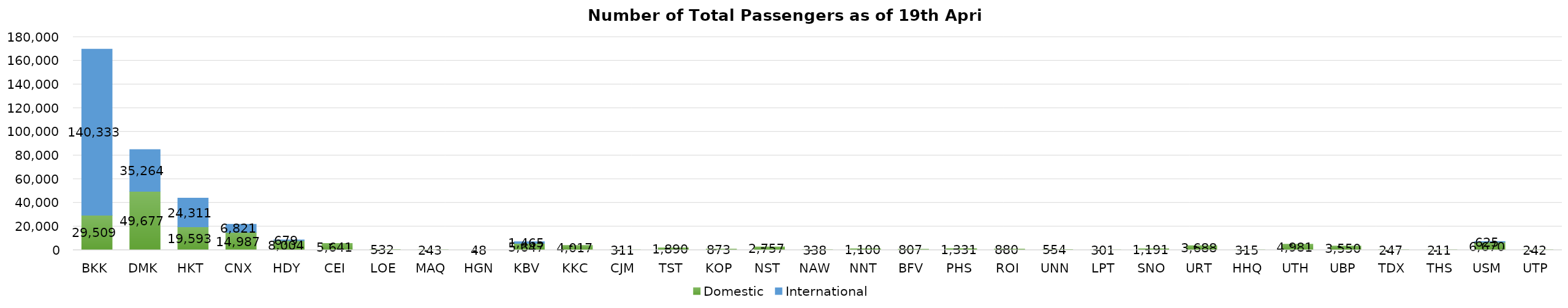
| Category | Domestic | International |
|---|---|---|
| BKK | 29509 | 140333 |
| DMK | 49677 | 35264 |
| HKT | 19593 | 24311 |
| CNX | 14987 | 6821 |
| HDY | 8004 | 679 |
| CEI | 5641 | 0 |
| LOE | 532 | 0 |
| MAQ | 243 | 0 |
| HGN | 48 | 0 |
| KBV | 5647 | 1465 |
| KKC | 4017 | 0 |
| CJM | 311 | 0 |
| TST | 1890 | 0 |
| KOP | 873 | 0 |
| NST | 2757 | 0 |
| NAW | 338 | 0 |
| NNT | 1100 | 0 |
| BFV | 807 | 0 |
| PHS | 1331 | 0 |
| ROI | 880 | 0 |
| UNN | 554 | 0 |
| LPT | 301 | 0 |
| SNO | 1191 | 0 |
| URT | 3688 | 0 |
| HHQ | 315 | 0 |
| UTH | 4981 | 0 |
| UBP | 3550 | 0 |
| TDX | 247 | 0 |
| THS | 211 | 0 |
| USM | 6670 | 625 |
| UTP | 242 | 0 |